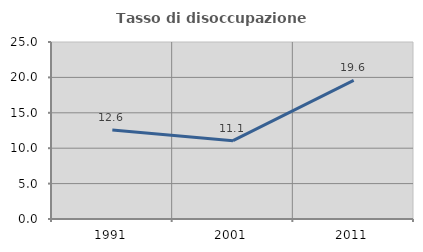
| Category | Tasso di disoccupazione giovanile  |
|---|---|
| 1991.0 | 12.568 |
| 2001.0 | 11.066 |
| 2011.0 | 19.577 |